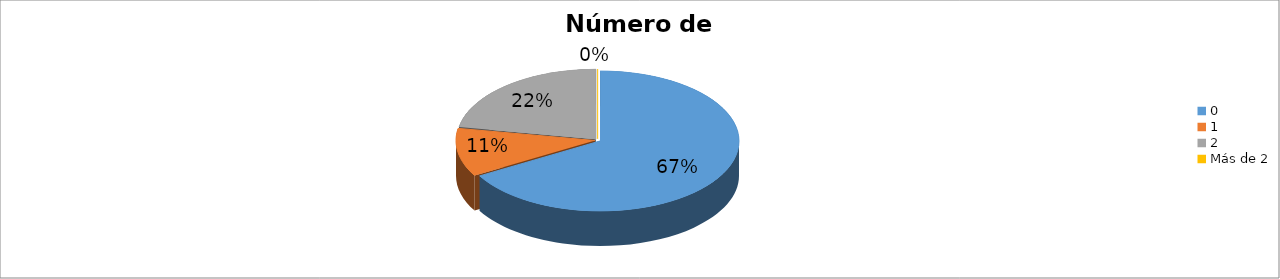
| Category | Series 0 |
|---|---|
| 0 | 0.667 |
| 1 | 0.111 |
| 2 | 0.222 |
| Más de 2 | 0 |